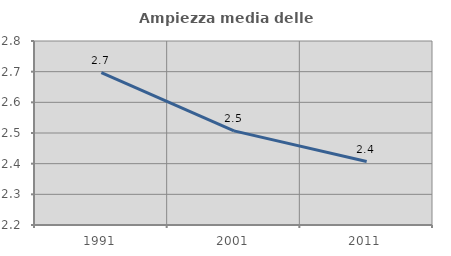
| Category | Ampiezza media delle famiglie |
|---|---|
| 1991.0 | 2.697 |
| 2001.0 | 2.507 |
| 2011.0 | 2.407 |